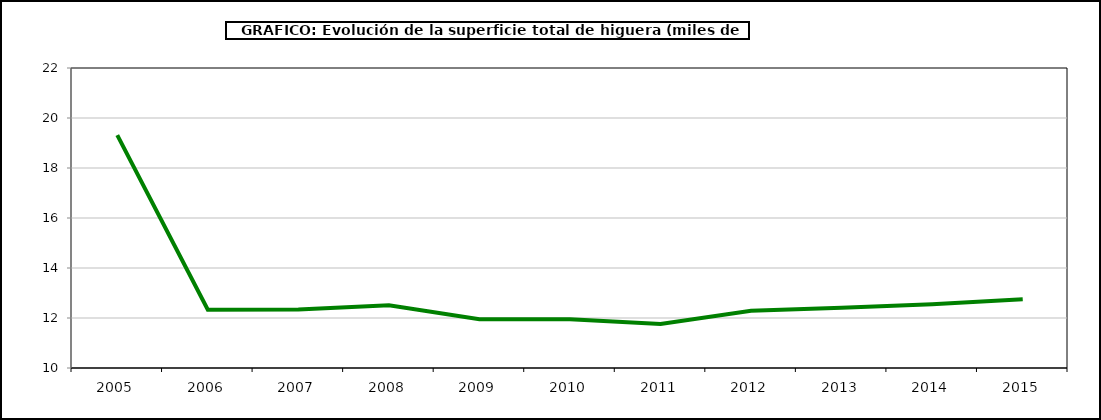
| Category | superficie higuera |
|---|---|
| 2005.0 | 19.314 |
| 2006.0 | 12.332 |
| 2007.0 | 12.344 |
| 2008.0 | 12.509 |
| 2009.0 | 11.953 |
| 2010.0 | 11.953 |
| 2011.0 | 11.761 |
| 2012.0 | 12.294 |
| 2013.0 | 12.411 |
| 2014.0 | 12.549 |
| 2015.0 | 12.751 |